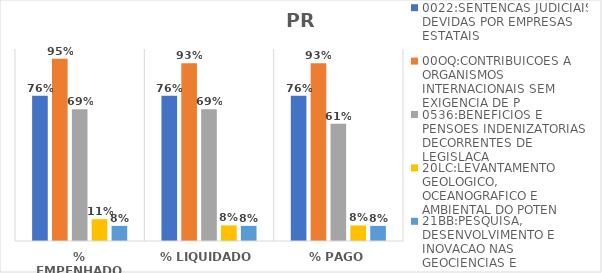
| Category | 0022:SENTENCAS JUDICIAIS DEVIDAS POR EMPRESAS ESTATAIS | 00OQ:CONTRIBUICOES A ORGANISMOS INTERNACIONAIS SEM EXIGENCIA DE P | 0536:BENEFICIOS E PENSOES INDENIZATORIAS DECORRENTES DE LEGISLACA | 20LC:LEVANTAMENTO GEOLOGICO, OCEANOGRAFICO E AMBIENTAL DO POTEN | 21BB:PESQUISA, DESENVOLVIMENTO E INOVACAO NAS GEOCIENCIAS E |
|---|---|---|---|---|---|
| % EMPENHADO | 0.756 | 0.95 | 0.687 | 0.114 | 0.079 |
| % LIQUIDADO | 0.756 | 0.926 | 0.687 | 0.081 | 0.079 |
| % PAGO | 0.756 | 0.926 | 0.611 | 0.081 | 0.079 |